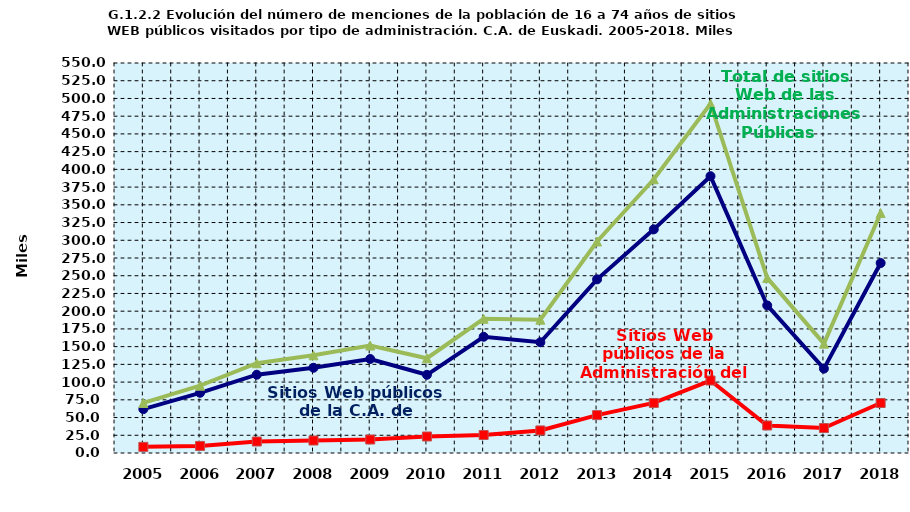
| Category | Sitios Web públicos de la C.A. de Euskadi | Sitios Web públicos de la Administración del Estado | Total de sitios Web de las Administraciones Públicas |
|---|---|---|---|
| 2005.0 | 61.9 | 8.7 | 70.6 |
| 2006.0 | 84.9 | 10 | 94.9 |
| 2007.0 | 110.4 | 16.2 | 126.6 |
| 2008.0 | 120.2 | 17.6 | 137.8 |
| 2009.0 | 132.6 | 19 | 151.6 |
| 2010.0 | 110.3 | 23.3 | 133.6 |
| 2011.0 | 163.9 | 25.4 | 189.3 |
| 2012.0 | 156.2 | 31.8 | 188 |
| 2013.0 | 244.9 | 53.4 | 298.3 |
| 2014.0 | 315.4 | 70.6 | 386 |
| 2015.0 | 390.4 | 102.2 | 492.6 |
| 2016.0 | 208.1 | 38.8 | 246.9 |
| 2017.0 | 119 | 35.2 | 154.2 |
| 2018.0 | 267.9 | 70.5 | 338.4 |